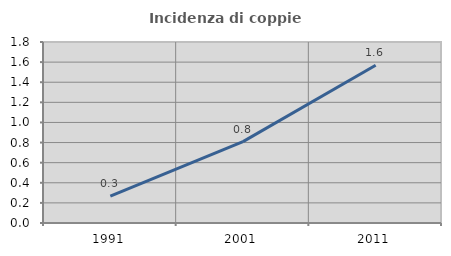
| Category | Incidenza di coppie miste |
|---|---|
| 1991.0 | 0.268 |
| 2001.0 | 0.809 |
| 2011.0 | 1.568 |